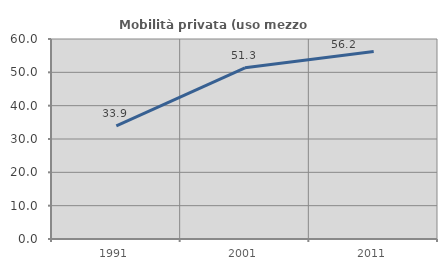
| Category | Mobilità privata (uso mezzo privato) |
|---|---|
| 1991.0 | 33.906 |
| 2001.0 | 51.345 |
| 2011.0 | 56.229 |